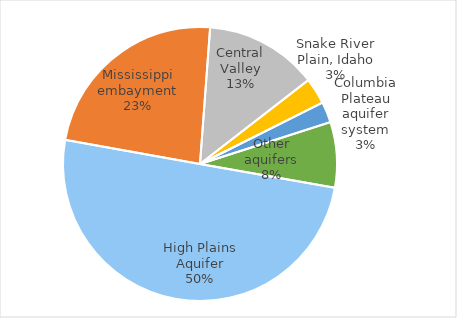
| Category | Series 0 |
|---|---|
| High Plains Aquifer | 12004.845 |
| Mississippi embayment | 5603.155 |
| Central Valley | 3197.982 |
| Snake River Plain, Idaho | 740.553 |
| Columbia Plateau aquifer system | 588.864 |
| Other aquifers | 1852.743 |